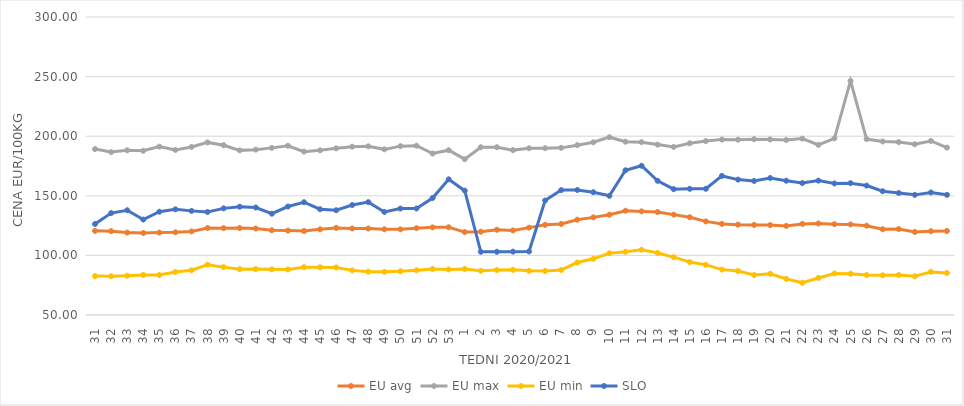
| Category | EU avg | EU max | EU min | SLO |
|---|---|---|---|---|
| 31.0 | 120.581 | 189.19 | 82.63 | 126.34 |
| 32.0 | 120.341 | 186.67 | 82.46 | 135.48 |
| 33.0 | 119.127 | 188.18 | 82.99 | 137.89 |
| 34.0 | 118.75 | 187.74 | 83.66 | 130.07 |
| 35.0 | 119.136 | 191.25 | 83.53 | 136.63 |
| 36.0 | 119.398 | 188.47 | 86.09 | 138.64 |
| 37.0 | 120.135 | 190.99 | 87.57 | 137.35 |
| 38.0 | 122.982 | 194.8 | 92.21 | 136.42 |
| 39.0 | 122.832 | 192.45 | 90.16 | 139.46 |
| 40.0 | 122.936 | 188.11 | 88.45 | 140.87 |
| 41.0 | 122.507 | 188.73 | 88.54 | 140.18 |
| 42.0 | 121.098 | 190.2 | 88.3 | 134.98 |
| 43.0 | 120.822 | 191.99 | 88.22 | 141 |
| 44.0 | 120.448 | 187.06 | 90.13 | 144.61 |
| 45.0 | 121.843 | 188.15 | 90.04 | 138.73 |
| 46.0 | 123.07 | 189.82 | 89.89 | 137.88 |
| 47.0 | 122.58 | 191.22 | 87.43 | 142.27 |
| 48.0 | 122.553 | 191.52 | 86.35 | 144.69 |
| 49.0 | 121.893 | 188.97 | 86.24 | 136.47 |
| 50.0 | 121.851 | 191.67 | 86.72 | 139.29 |
| 51.0 | 122.8 | 192.06 | 87.5 | 139.35 |
| 52.0 | 123.52 | 185.468 | 88.67 | 148.16 |
| 53.0 | 123.611 | 188.25 | 88.23 | 163.81 |
| 1.0 | 119.553 | 180.72 | 88.64 | 154.31 |
| 2.0 | 119.893 | 190.77 | 87.1 | 103.02 |
| 3.0 | 121.489 | 190.76 | 87.7 | 103.03 |
| 4.0 | 120.954 | 188.33 | 87.88 | 103.15 |
| 5.0 | 123.293 | 189.91 | 87.04 | 103.34 |
| 6.0 | 125.679 | 189.94 | 86.97 | 146.03 |
| 7.0 | 126.33 | 190.21 | 87.79 | 154.77 |
| 8.0 | 129.933 | 192.48 | 94.02 | 154.86 |
| 9.0 | 131.908 | 194.884 | 97.12 | 153 |
| 10.0 | 134.098 | 199.17 | 101.79 | 149.98 |
| 11.0 | 137.49 | 195.419 | 103.05 | 171.4 |
| 12.0 | 136.929 | 195.013 | 104.76 | 175.2 |
| 13.0 | 136.39 | 192.952 | 102.11 | 162.57 |
| 14.0 | 134.198 | 191.034 | 98.5 | 155.55 |
| 15.0 | 132.003 | 194.047 | 94.39 | 155.88 |
| 16.0 | 128.53 | 195.913 | 92.04 | 155.88 |
| 17.0 | 126.415 | 197.188 | 88.07 | 166.66 |
| 18.0 | 125.787 | 197.055 | 86.89 | 163.58 |
| 19.0 | 125.54 | 197.478 | 83.546 | 162.44 |
| 20.0 | 125.412 | 197.263 | 84.55 | 164.94 |
| 21.0 | 124.768 | 196.821 | 80.264 | 162.64 |
| 22.0 | 126.43 | 197.963 | 77.048 | 160.68 |
| 23.0 | 126.76 | 192.72 | 81.087 | 162.75 |
| 24.0 | 126.19 | 198.186 | 84.83 | 160.34 |
| 25.0 | 125.97 | 246.36 | 84.63 | 160.6 |
| 26.0 | 124.92 | 197.607 | 83.57 | 158.57 |
| 27.0 | 121.922 | 195.566 | 83.3 | 153.83 |
| 28.0 | 122.106 | 195.043 | 83.64 | 152.35 |
| 29.0 | 119.659 | 193.272 | 82.49 | 150.79 |
| 30.0 | 120.3 | 196.01 | 86.16 | 152.82 |
| 31.0 | 120.473 | 190.42 | 85.26 | 150.8 |